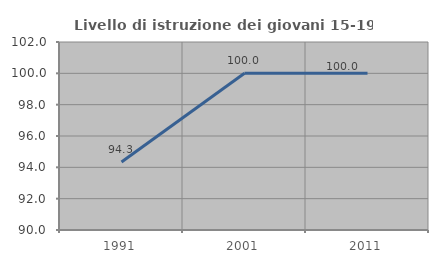
| Category | Livello di istruzione dei giovani 15-19 anni |
|---|---|
| 1991.0 | 94.34 |
| 2001.0 | 100 |
| 2011.0 | 100 |